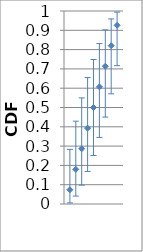
| Category | 0.5 |
|---|---|
| 1.0 | 0.074 |
| 3.0 | 0.286 |
| 5.0 | 0.5 |
| 2.0 | 0.18 |
| 8.0 | 0.82 |
| 7.0 | 0.714 |
| 4.0 | 0.393 |
| 6.0 | 0.607 |
| 9.0 | 0.926 |